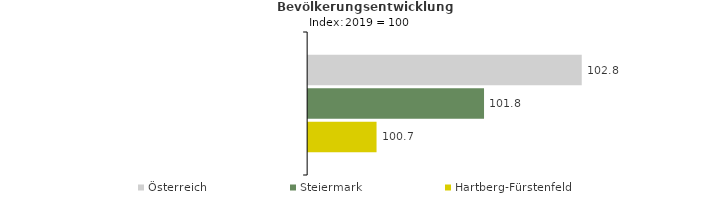
| Category | Österreich | Steiermark | Hartberg-Fürstenfeld |
|---|---|---|---|
| 2023.0 | 102.8 | 101.8 | 100.7 |